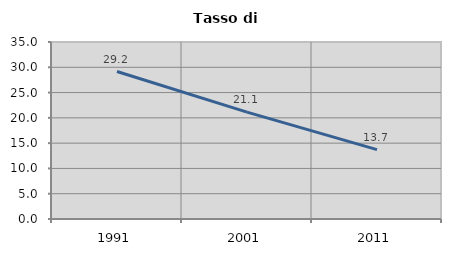
| Category | Tasso di disoccupazione   |
|---|---|
| 1991.0 | 29.167 |
| 2001.0 | 21.127 |
| 2011.0 | 13.72 |